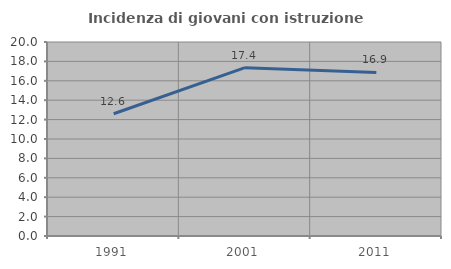
| Category | Incidenza di giovani con istruzione universitaria |
|---|---|
| 1991.0 | 12.605 |
| 2001.0 | 17.355 |
| 2011.0 | 16.867 |